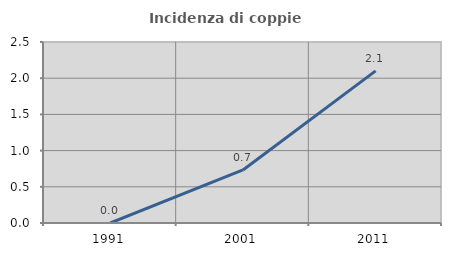
| Category | Incidenza di coppie miste |
|---|---|
| 1991.0 | 0 |
| 2001.0 | 0.733 |
| 2011.0 | 2.101 |